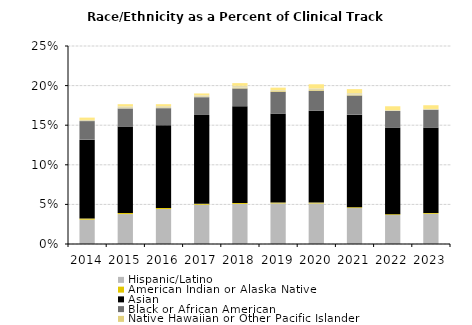
| Category | Hispanic/Latino | American Indian or Alaska Native | Asian  | Black or African American | Native Hawaiian or Other Pacific Islander | Two or More Races - URM | Two or More Races - Non-URM |
|---|---|---|---|---|---|---|---|
| 2014.0 | 0.031 | 0.001 | 0.1 | 0.023 | 0 | 0.001 | 0.003 |
| 2015.0 | 0.038 | 0.001 | 0.109 | 0.023 | 0 | 0.003 | 0.003 |
| 2016.0 | 0.044 | 0.001 | 0.105 | 0.021 | 0 | 0.003 | 0.003 |
| 2017.0 | 0.05 | 0.001 | 0.112 | 0.022 | 0 | 0.002 | 0.002 |
| 2018.0 | 0.051 | 0.001 | 0.122 | 0.022 | 0.001 | 0.002 | 0.003 |
| 2019.0 | 0.051 | 0.001 | 0.112 | 0.028 | 0.001 | 0.001 | 0.003 |
| 2020.0 | 0.051 | 0.001 | 0.116 | 0.025 | 0.001 | 0.002 | 0.005 |
| 2021.0 | 0.045 | 0.001 | 0.117 | 0.024 | 0.001 | 0.002 | 0.005 |
| 2022.0 | 0.037 | 0.001 | 0.11 | 0.021 | 0 | 0.001 | 0.005 |
| 2023.0 | 0.038 | 0.001 | 0.108 | 0.022 | 0 | 0.001 | 0.005 |